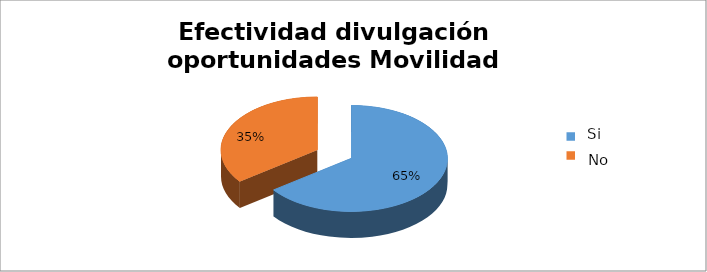
| Category | Series 0 |
|---|---|
| 0 | 0.649 |
| 1 | 0.351 |